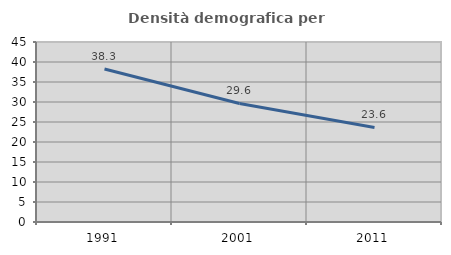
| Category | Densità demografica |
|---|---|
| 1991.0 | 38.254 |
| 2001.0 | 29.631 |
| 2011.0 | 23.629 |